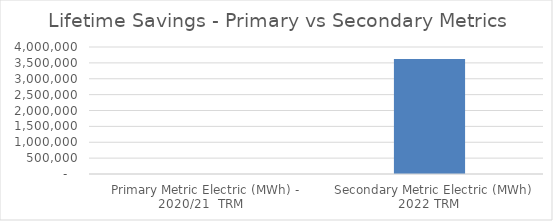
| Category | Series 0 |
|---|---|
|  Primary Metric Electric (MWh) - 2020/21  TRM  | 0 |
|  Secondary Metric Electric (MWh) 2022 TRM  | 3625802.11 |